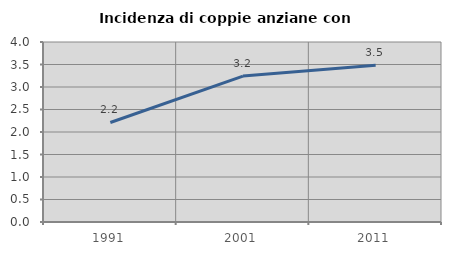
| Category | Incidenza di coppie anziane con figli |
|---|---|
| 1991.0 | 2.211 |
| 2001.0 | 3.242 |
| 2011.0 | 3.483 |